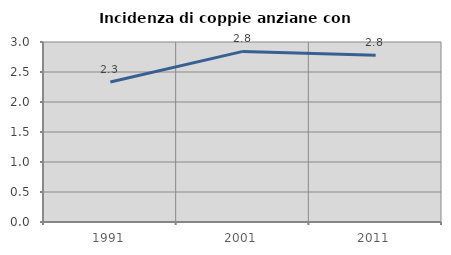
| Category | Incidenza di coppie anziane con figli |
|---|---|
| 1991.0 | 2.334 |
| 2001.0 | 2.844 |
| 2011.0 | 2.78 |